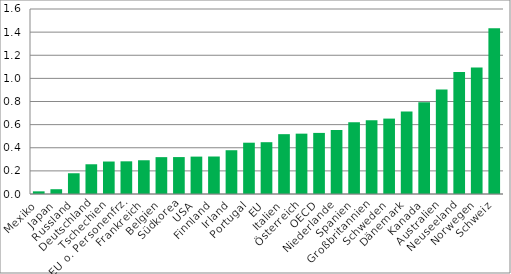
| Category | 2010 |
|---|---|
| Mexiko | 0.023 |
| Japan | 0.041 |
| Russland | 0.179 |
| Deutschland | 0.257 |
| Tschechien | 0.281 |
| EU o. Personenfrz. | 0.283 |
| Frankreich | 0.292 |
| Belgien | 0.319 |
| Südkorea | 0.319 |
| USA | 0.323 |
| Finnland | 0.324 |
| Irland | 0.379 |
| Portugal | 0.444 |
| EU | 0.448 |
| Italien | 0.518 |
| Österreich | 0.522 |
| OECD | 0.528 |
| Niederlande | 0.554 |
| Spanien | 0.621 |
| Großbritannien | 0.638 |
| Schweden | 0.652 |
| Dänemark | 0.714 |
| Kanada | 0.794 |
| Australien | 0.904 |
| Neuseeland | 1.055 |
| Norwegen | 1.095 |
| Schweiz | 1.433 |